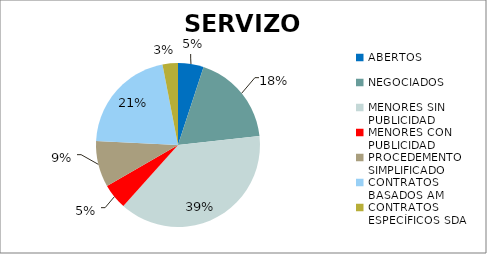
| Category | Series 0 |
|---|---|
| ABERTOS  | 0.051 |
| NEGOCIADOS  | 0.182 |
| MENORES SIN PUBLICIDAD | 0.384 |
| MENORES CON PUBLICIDAD | 0.051 |
| PROCEDEMENTO SIMPLIFICADO | 0.091 |
| CONTRATOS BASADOS AM | 0.212 |
| CONTRATOS ESPECÍFICOS SDA | 0.03 |